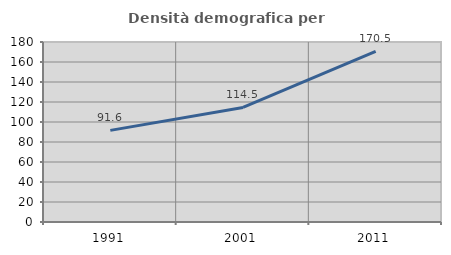
| Category | Densità demografica |
|---|---|
| 1991.0 | 91.623 |
| 2001.0 | 114.509 |
| 2011.0 | 170.514 |